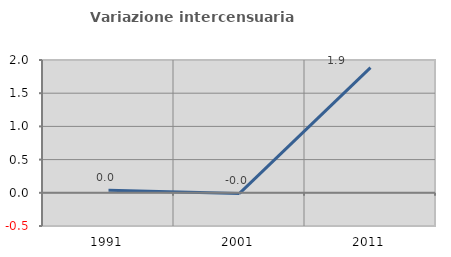
| Category | Variazione intercensuaria annua |
|---|---|
| 1991.0 | 0.039 |
| 2001.0 | -0.009 |
| 2011.0 | 1.885 |